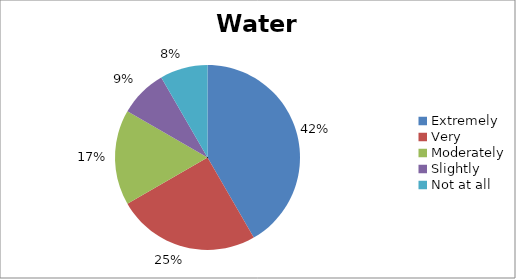
| Category | Water |
|---|---|
| Extremely | 5 |
| Very | 3 |
| Moderately | 2 |
| Slightly | 1 |
| Not at all | 1 |